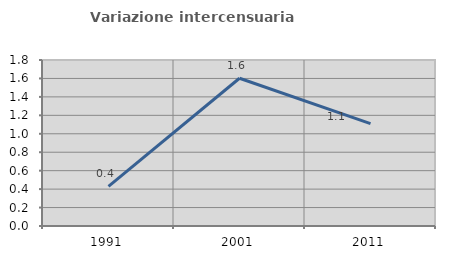
| Category | Variazione intercensuaria annua |
|---|---|
| 1991.0 | 0.431 |
| 2001.0 | 1.602 |
| 2011.0 | 1.11 |